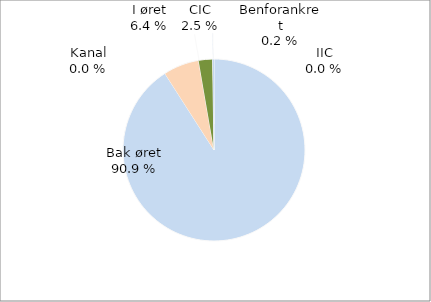
| Category | Series 0 |
|---|---|
| Bak øret | 24382 |
| I øret | 1704 |
| Kanal | 0 |
| CIC | 665 |
| IIC | 8 |
| Benforankret | 55 |